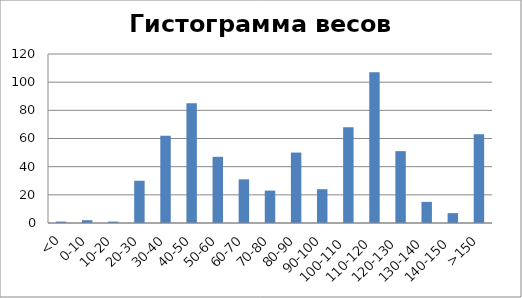
| Category | Series 0 |
|---|---|
| <0 | 1 |
| 0-10 | 2 |
| 10-20 | 1 |
| 20-30 | 30 |
| 30-40 | 62 |
| 40-50 | 85 |
| 50-60 | 47 |
| 60-70 | 31 |
| 70-80 | 23 |
| 80-90 | 50 |
| 90-100 | 24 |
| 100-110 | 68 |
| 110-120 | 107 |
| 120-130 | 51 |
| 130-140 | 15 |
| 140-150 | 7 |
| >150 | 63 |